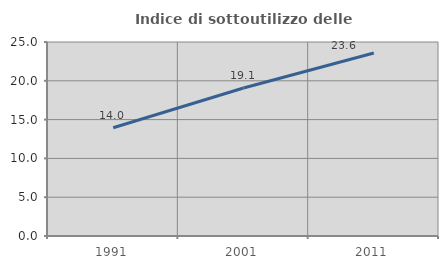
| Category | Indice di sottoutilizzo delle abitazioni  |
|---|---|
| 1991.0 | 13.957 |
| 2001.0 | 19.069 |
| 2011.0 | 23.588 |